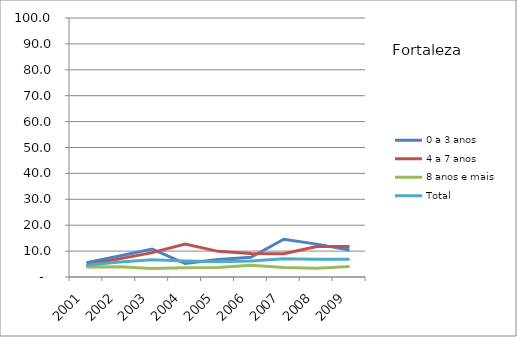
| Category | 0 a 3 anos | 4 a 7 anos | 8 anos e mais | Total |
|---|---|---|---|---|
| 2001.0 | 5.5 | 4.5 | 3.9 | 4.5 |
| 2002.0 | 8.1 | 7 | 4 | 5.8 |
| 2003.0 | 10.8 | 9.4 | 3.3 | 6.7 |
| 2004.0 | 5.2 | 12.7 | 3.6 | 6.2 |
| 2005.0 | 6.8 | 9.9 | 3.7 | 5.9 |
| 2006.0 | 7.6 | 9.1 | 4.5 | 6.2 |
| 2007.0 | 14.6 | 9 | 3.7 | 7 |
| 2008.0 | 12.7 | 11.8 | 3.4 | 6.9 |
| 2009.0 | 10.4 | 11.8 | 4.1 | 6.9 |